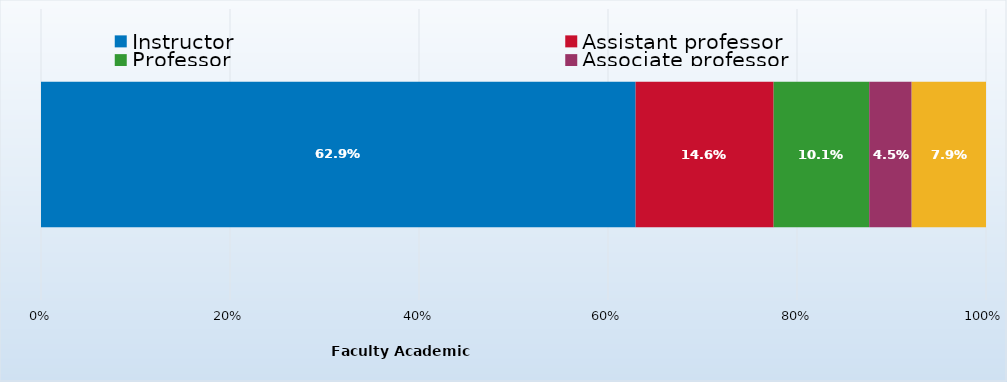
| Category | Instructor | Assistant professor | Professor | Associate professor | Lab technician/Lab associate |
|---|---|---|---|---|---|
| 0 | 0.629 | 0.146 | 0.101 | 0.045 | 0.079 |